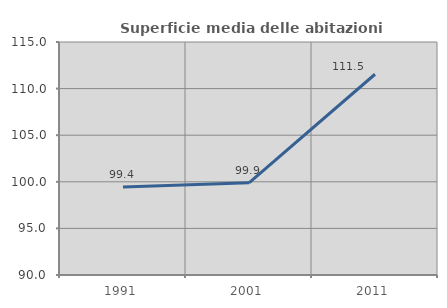
| Category | Superficie media delle abitazioni occupate |
|---|---|
| 1991.0 | 99.439 |
| 2001.0 | 99.895 |
| 2011.0 | 111.541 |